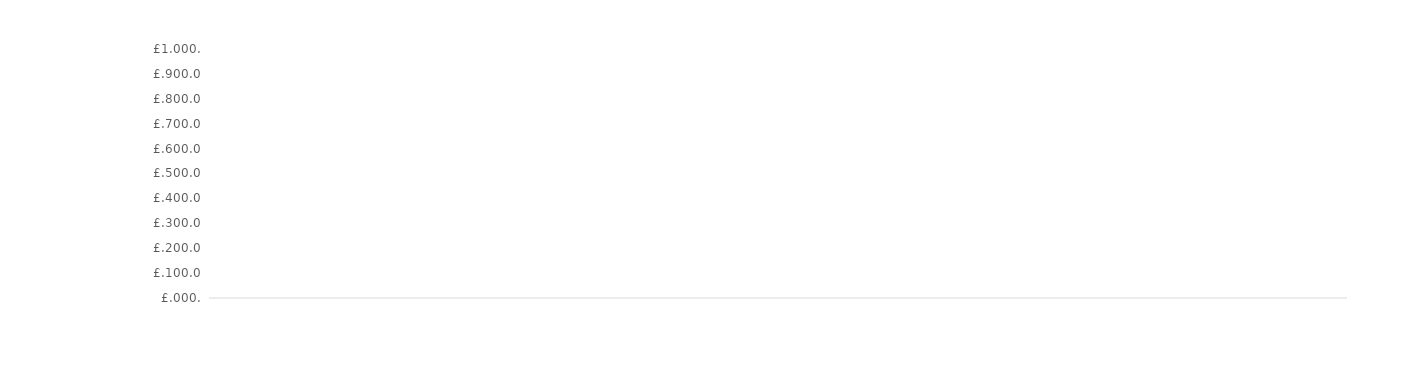
| Category | Series 2 |
|---|---|
|  | 0 |
|  | 0 |
|  | 0 |
|  | 0 |
|  | 0 |
|  | 0 |
|  | 0 |
|  | 0 |
|  | 0 |
|  | 0 |
|  | 0 |
|  | 0 |
|  | 0 |
|  | 0 |
|  | 0 |
|  | 0 |
|  | 0 |
|  | 0 |
|  | 0 |
|  | 0 |
|  | 0 |
|  | 0 |
|  | 0 |
|  | 0 |
|  | 0 |
|  | 0 |
|  | 0 |
|  | 0 |
|  | 0 |
|  | 0 |
|  | 0 |
|  | 0 |
|  | 0 |
|  | 0 |
|  | 0 |
|  | 0 |
|  | 0 |
|  | 0 |
|  | 0 |
|  | 0 |
|  | 0 |
|  | 0 |
|  | 0 |
|  | 0 |
|  | 0 |
|  | 0 |
|  | 0 |
|  | 0 |
|  | 0 |
|  | 0 |